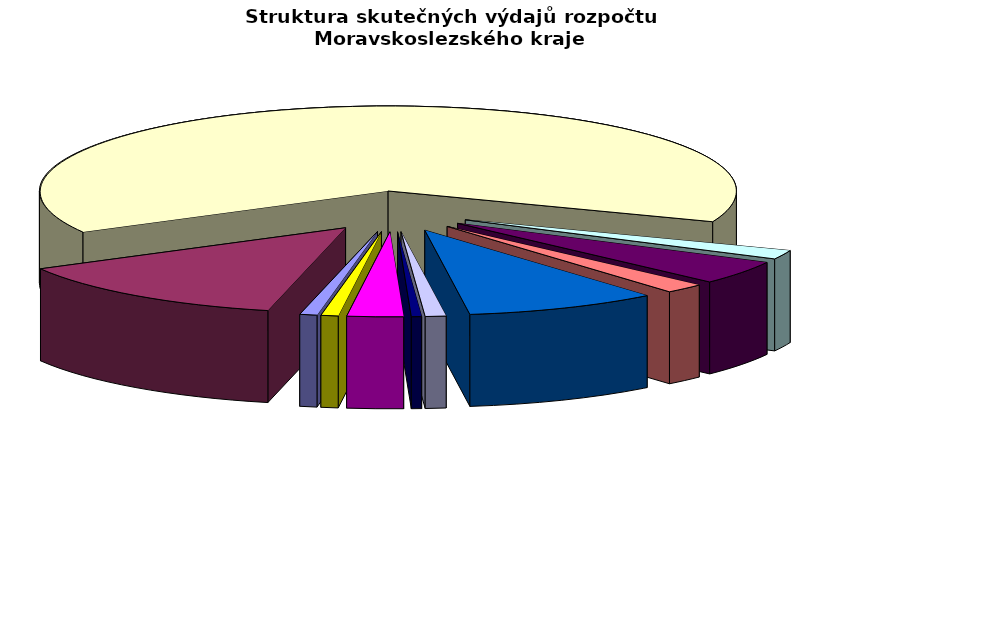
| Category | Series 0 |
|---|---|
| Regionální rozvoj | 160334.318 |
| Doprava a chytrý region | 2678202.16 |
| Školství | 12783550.443 |
| Kultura | 342982.991 |
| Zdravotnictví | 903239.359 |
| Životní prostředí | 371824.375 |
| Sociální věci | 1789027.157 |
| Krizové řízení | 192331.818 |
| Cestovní ruch | 94450.725 |
| Všeobecná veřejná správa a služby | 521930.587 |
| Ostatní | 159810.114 |